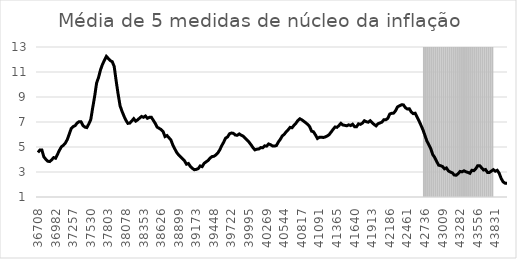
| Category | Series 1 |
|---|---|
| 0 | -1 |
| 1900-01-01 | -1 |
| 1900-01-02 | -1 |
| 1900-01-03 | -1 |
| 1900-01-04 | -1 |
| 1900-01-05 | -1 |
| 1900-01-06 | -1 |
| 1900-01-07 | -1 |
| 1900-01-08 | -1 |
| 1900-01-09 | -1 |
| 1900-01-10 | -1 |
| 1900-01-11 | -1 |
| 1900-01-12 | -1 |
| 1900-01-13 | -1 |
| 1900-01-14 | -1 |
| 1900-01-15 | -1 |
| 1900-01-16 | -1 |
| 1900-01-17 | -1 |
| 1900-01-18 | -1 |
| 1900-01-19 | -1 |
| 1900-01-20 | -1 |
| 1900-01-21 | -1 |
| 1900-01-22 | -1 |
| 1900-01-23 | -1 |
| 1900-01-24 | -1 |
| 1900-01-25 | -1 |
| 1900-01-26 | -1 |
| 1900-01-27 | -1 |
| 1900-01-28 | -1 |
| 1900-01-29 | -1 |
| 1900-01-30 | -1 |
| 1900-01-31 | -1 |
| 1900-02-01 | -1 |
| 1900-02-02 | -1 |
| 1900-02-03 | -1 |
| 1900-02-04 | -1 |
| 1900-02-05 | -1 |
| 1900-02-06 | -1 |
| 1900-02-07 | -1 |
| 1900-02-08 | -1 |
| 1900-02-09 | -1 |
| 1900-02-10 | -1 |
| 1900-02-11 | -1 |
| 1900-02-12 | -1 |
| 1900-02-13 | -1 |
| 1900-02-14 | -1 |
| 1900-02-15 | -1 |
| 1900-02-16 | -1 |
| 1900-02-17 | -1 |
| 1900-02-18 | -1 |
| 1900-02-19 | -1 |
| 1900-02-20 | -1 |
| 1900-02-21 | -1 |
| 1900-02-22 | -1 |
| 1900-02-23 | -1 |
| 1900-02-24 | -1 |
| 1900-02-25 | -1 |
| 1900-02-26 | -1 |
| 1900-02-27 | -1 |
| 1900-02-28 | -1 |
| 1900-02-28 | -1 |
| 1900-03-01 | -1 |
| 1900-03-02 | -1 |
| 1900-03-03 | -1 |
| 1900-03-04 | -1 |
| 1900-03-05 | -1 |
| 1900-03-06 | -1 |
| 1900-03-07 | -1 |
| 1900-03-08 | -1 |
| 1900-03-09 | -1 |
| 1900-03-10 | -1 |
| 1900-03-11 | -1 |
| 1900-03-12 | -1 |
| 1900-03-13 | -1 |
| 1900-03-14 | -1 |
| 1900-03-15 | -1 |
| 1900-03-16 | -1 |
| 1900-03-17 | -1 |
| 1900-03-18 | -1 |
| 1900-03-19 | -1 |
| 1900-03-20 | -1 |
| 1900-03-21 | -1 |
| 1900-03-22 | -1 |
| 1900-03-23 | -1 |
| 1900-03-24 | -1 |
| 1900-03-25 | -1 |
| 1900-03-26 | -1 |
| 1900-03-27 | -1 |
| 1900-03-28 | -1 |
| 1900-03-29 | -1 |
| 1900-03-30 | -1 |
| 1900-03-31 | -1 |
| 1900-04-01 | -1 |
| 1900-04-02 | -1 |
| 1900-04-03 | -1 |
| 1900-04-04 | -1 |
| 1900-04-05 | -1 |
| 1900-04-06 | -1 |
| 1900-04-07 | -1 |
| 1900-04-08 | -1 |
| 1900-04-09 | -1 |
| 1900-04-10 | -1 |
| 1900-04-11 | -1 |
| 1900-04-12 | -1 |
| 1900-04-13 | -1 |
| 1900-04-14 | -1 |
| 1900-04-15 | -1 |
| 1900-04-16 | -1 |
| 1900-04-17 | -1 |
| 1900-04-18 | -1 |
| 1900-04-19 | -1 |
| 1900-04-20 | -1 |
| 1900-04-21 | -1 |
| 1900-04-22 | -1 |
| 1900-04-23 | -1 |
| 1900-04-24 | -1 |
| 1900-04-25 | -1 |
| 1900-04-26 | -1 |
| 1900-04-27 | -1 |
| 1900-04-28 | -1 |
| 1900-04-29 | -1 |
| 1900-04-30 | -1 |
| 1900-05-01 | -1 |
| 1900-05-02 | -1 |
| 1900-05-03 | -1 |
| 1900-05-04 | -1 |
| 1900-05-05 | -1 |
| 1900-05-06 | -1 |
| 1900-05-07 | -1 |
| 1900-05-08 | -1 |
| 1900-05-09 | -1 |
| 1900-05-10 | -1 |
| 1900-05-11 | -1 |
| 1900-05-12 | -1 |
| 1900-05-13 | -1 |
| 1900-05-14 | -1 |
| 1900-05-15 | -1 |
| 1900-05-16 | -1 |
| 1900-05-17 | -1 |
| 1900-05-18 | -1 |
| 1900-05-19 | -1 |
| 1900-05-20 | -1 |
| 1900-05-21 | -1 |
| 1900-05-22 | -1 |
| 1900-05-23 | -1 |
| 1900-05-24 | -1 |
| 1900-05-25 | -1 |
| 1900-05-26 | -1 |
| 1900-05-27 | -1 |
| 1900-05-28 | -1 |
| 1900-05-29 | -1 |
| 1900-05-30 | -1 |
| 1900-05-31 | -1 |
| 1900-06-01 | -1 |
| 1900-06-02 | -1 |
| 1900-06-03 | -1 |
| 1900-06-04 | -1 |
| 1900-06-05 | -1 |
| 1900-06-06 | -1 |
| 1900-06-07 | -1 |
| 1900-06-08 | -1 |
| 1900-06-09 | -1 |
| 1900-06-10 | -1 |
| 1900-06-11 | -1 |
| 1900-06-12 | -1 |
| 1900-06-13 | -1 |
| 1900-06-14 | -1 |
| 1900-06-15 | -1 |
| 1900-06-16 | -1 |
| 1900-06-17 | -1 |
| 1900-06-18 | -1 |
| 1900-06-19 | -1 |
| 1900-06-20 | -1 |
| 1900-06-21 | -1 |
| 1900-06-22 | -1 |
| 1900-06-23 | -1 |
| 1900-06-24 | -1 |
| 1900-06-25 | -1 |
| 1900-06-26 | -1 |
| 1900-06-27 | -1 |
| 1900-06-28 | -1 |
| 1900-06-29 | -1 |
| 1900-06-30 | -1 |
| 1900-07-01 | -1 |
| 1900-07-02 | -1 |
| 1900-07-03 | -1 |
| 1900-07-04 | -1 |
| 1900-07-05 | -1 |
| 1900-07-06 | -1 |
| 1900-07-07 | -1 |
| 1900-07-08 | -1 |
| 1900-07-09 | -1 |
| 1900-07-10 | -1 |
| 1900-07-11 | -1 |
| 1900-07-12 | -1 |
| 1900-07-13 | -1 |
| 1900-07-14 | -1 |
| 1900-07-15 | -1 |
| 1900-07-16 | 100 |
| 1900-07-17 | 100 |
| 1900-07-18 | 100 |
| 1900-07-19 | 100 |
| 1900-07-20 | 100 |
| 1900-07-21 | 100 |
| 1900-07-22 | 100 |
| 1900-07-23 | 100 |
| 1900-07-24 | 100 |
| 1900-07-25 | 100 |
| 1900-07-26 | 100 |
| 1900-07-27 | 100 |
| 1900-07-28 | 100 |
| 1900-07-29 | 100 |
| 1900-07-30 | 100 |
| 1900-07-31 | 100 |
| 1900-08-01 | 100 |
| 1900-08-02 | 100 |
| 1900-08-03 | 100 |
| 1900-08-04 | 100 |
| 1900-08-05 | 100 |
| 1900-08-06 | 100 |
| 1900-08-07 | 100 |
| 1900-08-08 | 100 |
| 1900-08-09 | 100 |
| 1900-08-10 | 100 |
| 1900-08-11 | 100 |
| 1900-08-12 | 100 |
| 1900-08-13 | 100 |
| 1900-08-14 | 100 |
| 1900-08-15 | 100 |
| 1900-08-16 | 100 |
| 1900-08-17 | 100 |
| 1900-08-18 | 100 |
| 1900-08-19 | 100 |
| 1900-08-20 | 100 |
| 1900-08-21 | -1 |
| 1900-08-22 | -1 |
| 1900-08-23 | -1 |
| 1900-08-24 | -1 |
| 1900-08-25 | -1 |
| 1900-08-26 | -1 |
| 1900-08-27 | -1 |